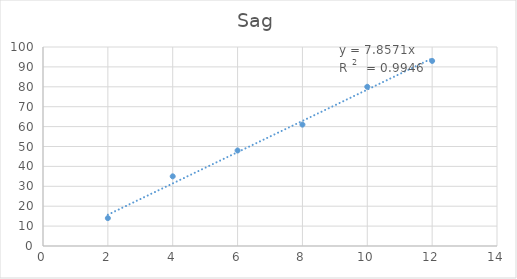
| Category | Sag |
|---|---|
| 2.0 | 14 |
| 4.0 | 35 |
| 6.0 | 48 |
| 8.0 | 61 |
| 10.0 | 80 |
| 12.0 | 93 |